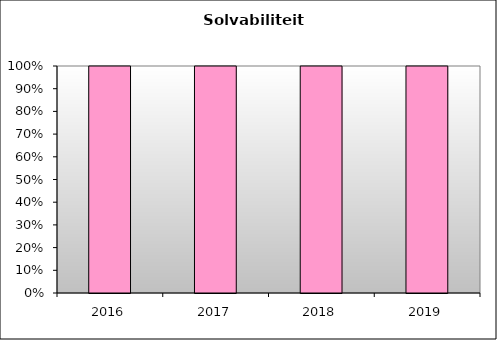
| Category | solv 1 |
|---|---|
| 2016.0 | 1 |
| 2017.0 | 1 |
| 2018.0 | 1 |
| 2019.0 | 1 |